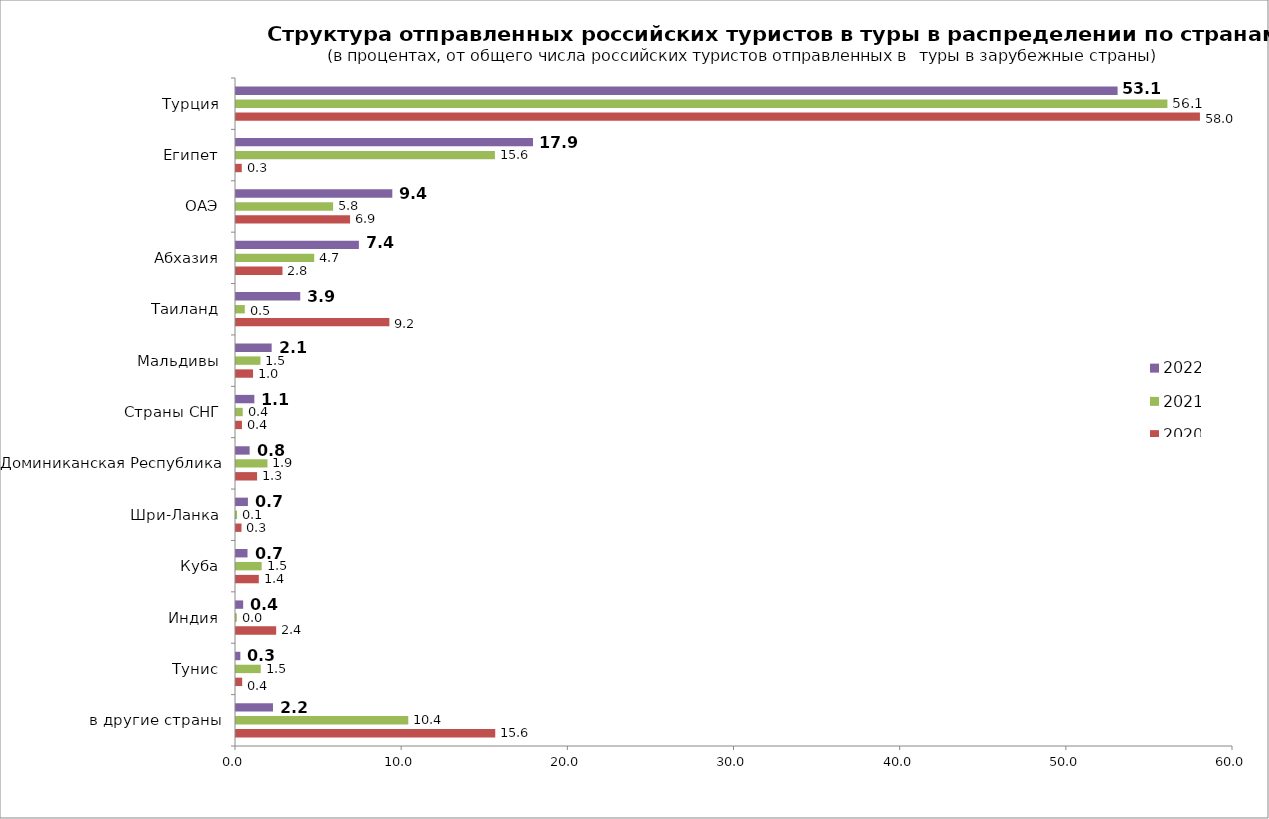
| Category | 2020 | 2021 | 2022 |
|---|---|---|---|
| в другие страны | 15.602 | 10.369 | 2.226 |
| Тунис | 0.373 | 1.489 | 0.261 |
| Индия | 2.418 | 0.046 | 0.432 |
| Куба | 1.374 | 1.545 | 0.694 |
| Шри-Ланка | 0.331 | 0.065 | 0.717 |
| Доминиканская Республика | 1.269 | 1.895 | 0.822 |
| Страны СНГ | 0.357 | 0.405 | 1.104 |
| Мальдивы | 1.027 | 1.471 | 2.146 |
| Таиланд | 9.231 | 0.529 | 3.866 |
| Абхазия | 2.798 | 4.707 | 7.396 |
| ОАЭ | 6.864 | 5.844 | 9.407 |
| Египет | 0.347 | 15.581 | 17.874 |
| Турция | 58.01 | 56.054 | 53.056 |